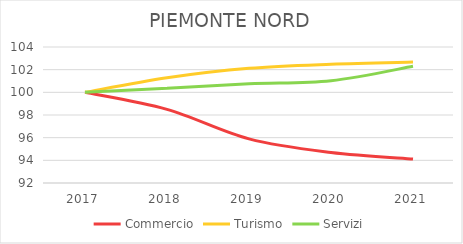
| Category | Commercio | Turismo | Servizi |
|---|---|---|---|
| 2017.0 | 100 | 100 | 100 |
| 2018.0 | 98.494 | 101.287 | 100.367 |
| 2019.0 | 95.893 | 102.121 | 100.761 |
| 2020.0 | 94.7 | 102.481 | 101.024 |
| 2021.0 | 94.12 | 102.666 | 102.295 |